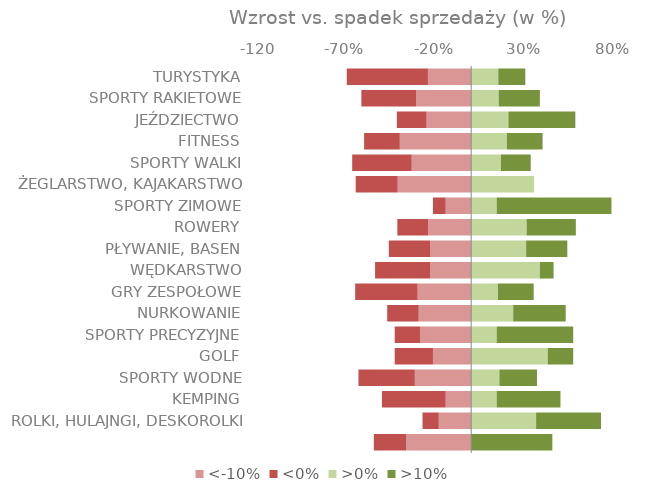
| Category | <-10% | <0% | >0% | >10% |
|---|---|---|---|---|
| TURYSTYKA | -0.242 | -0.455 | 0.152 | 0.152 |
| SPORTY RAKIETOWE | -0.308 | -0.308 | 0.154 | 0.231 |
| JEŹDZIECTWO | -0.25 | -0.167 | 0.208 | 0.375 |
| FITNESS | -0.4 | -0.2 | 0.2 | 0.2 |
| SPORTY WALKI | -0.333 | -0.333 | 0.167 | 0.167 |
| ŻEGLARSTWO, KAJAKARSTWO | -0.412 | -0.235 | 0.353 | 0 |
| SPORTY ZIMOWE | -0.143 | -0.071 | 0.143 | 0.643 |
| ROWERY | -0.241 | -0.172 | 0.31 | 0.276 |
| PŁYWANIE, BASEN | -0.231 | -0.231 | 0.308 | 0.231 |
| WĘDKARSTWO | -0.231 | -0.308 | 0.385 | 0.077 |
| GRY ZESPOŁOWE | -0.3 | -0.35 | 0.15 | 0.2 |
| NURKOWANIE | -0.294 | -0.176 | 0.235 | 0.294 |
| SPORTY PRECYZYJNE | -0.286 | -0.143 | 0.143 | 0.429 |
| GOLF | -0.214 | -0.214 | 0.429 | 0.143 |
| SPORTY WODNE | -0.316 | -0.316 | 0.158 | 0.211 |
| KEMPING | -0.143 | -0.357 | 0.143 | 0.357 |
| ROLKI, HULAJNGI, DESKOROLKI | -0.182 | -0.091 | 0.364 | 0.364 |